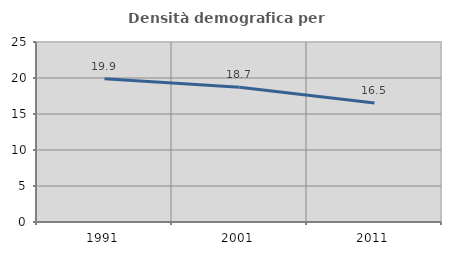
| Category | Densità demografica |
|---|---|
| 1991.0 | 19.884 |
| 2001.0 | 18.709 |
| 2011.0 | 16.54 |